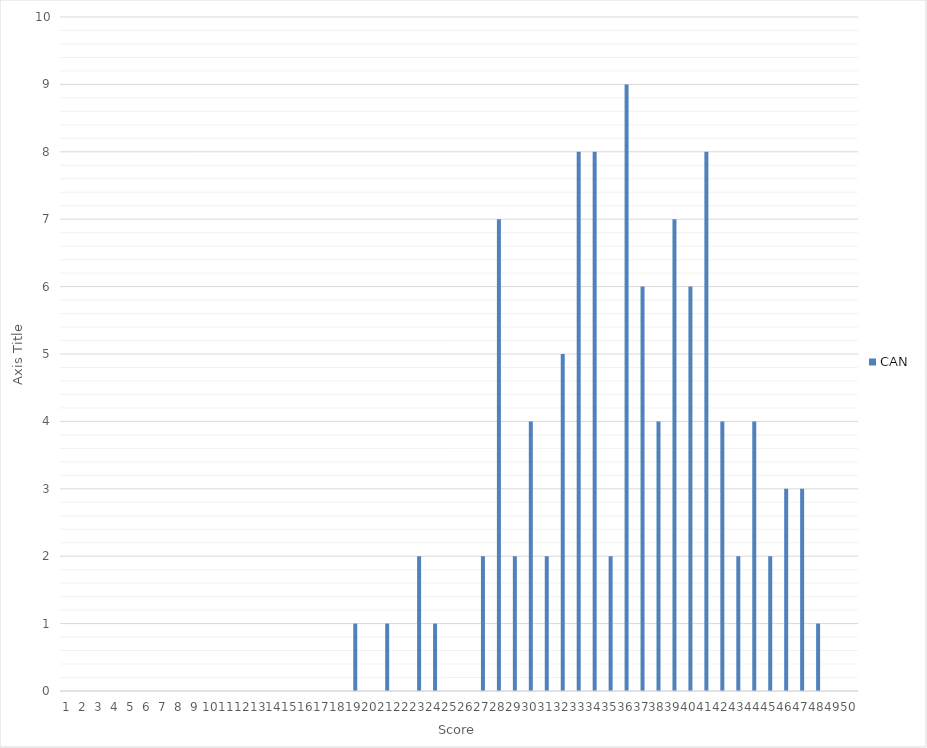
| Category | CAN |
|---|---|
| 0 | 0 |
| 1 | 0 |
| 2 | 0 |
| 3 | 0 |
| 4 | 0 |
| 5 | 0 |
| 6 | 0 |
| 7 | 0 |
| 8 | 0 |
| 9 | 0 |
| 10 | 0 |
| 11 | 0 |
| 12 | 0 |
| 13 | 0 |
| 14 | 0 |
| 15 | 0 |
| 16 | 0 |
| 17 | 0 |
| 18 | 1 |
| 19 | 0 |
| 20 | 1 |
| 21 | 0 |
| 22 | 2 |
| 23 | 1 |
| 24 | 0 |
| 25 | 0 |
| 26 | 2 |
| 27 | 7 |
| 28 | 2 |
| 29 | 4 |
| 30 | 2 |
| 31 | 5 |
| 32 | 8 |
| 33 | 8 |
| 34 | 2 |
| 35 | 9 |
| 36 | 6 |
| 37 | 4 |
| 38 | 7 |
| 39 | 6 |
| 40 | 8 |
| 41 | 4 |
| 42 | 2 |
| 43 | 4 |
| 44 | 2 |
| 45 | 3 |
| 46 | 3 |
| 47 | 1 |
| 48 | 0 |
| 49 | 0 |